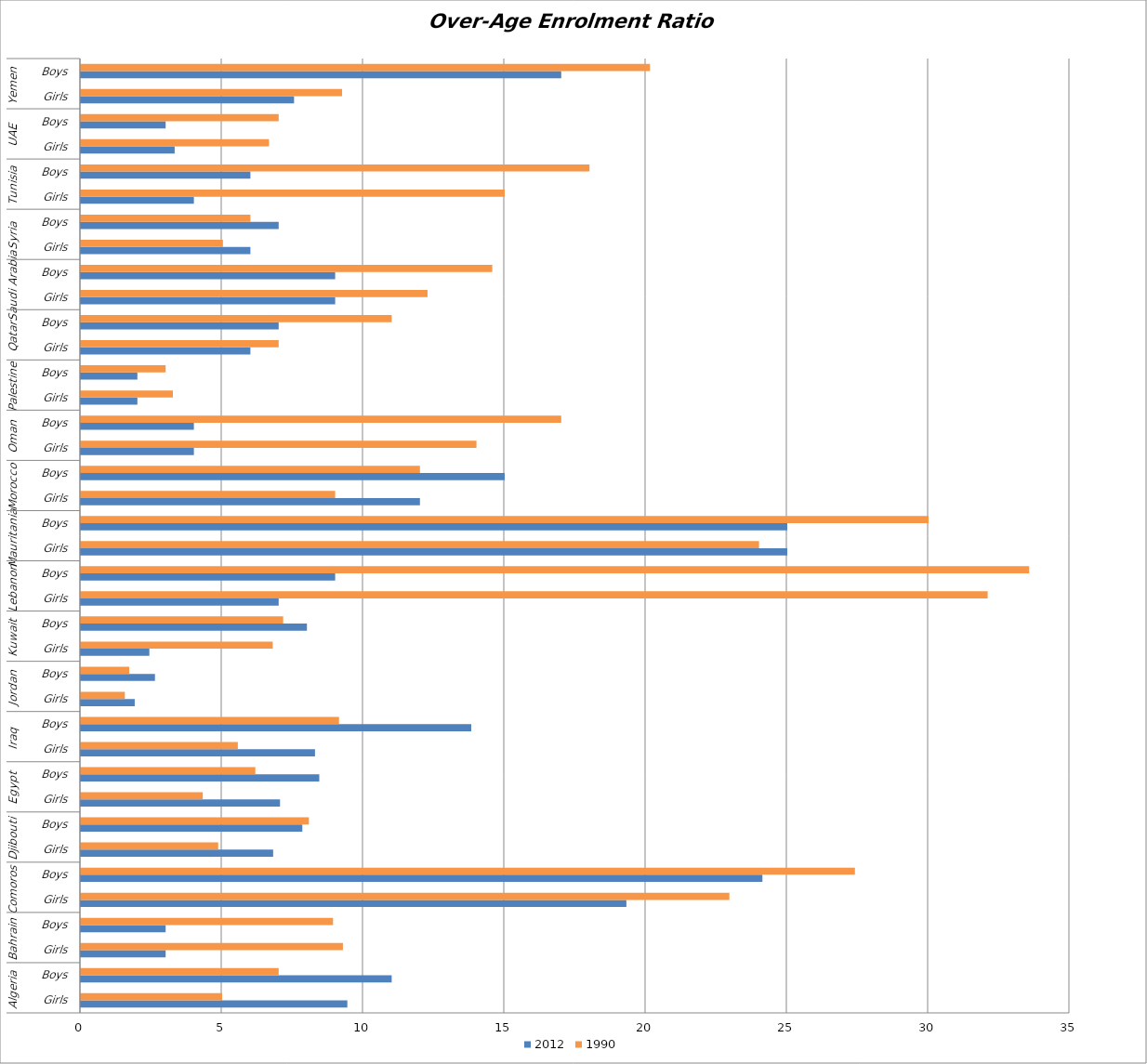
| Category | 2012 | 1990 |
|---|---|---|
| 0 | 9.43 | 5 |
| 1 | 11 | 7 |
| 2 | 3 | 9.274 |
| 3 | 3 | 8.924 |
| 4 | 19.306 | 22.951 |
| 5 | 24.12 | 27.393 |
| 6 | 6.805 | 4.86 |
| 7 | 7.837 | 8.07 |
| 8 | 7.048 | 4.313 |
| 9 | 8.437 | 6.175 |
| 10 | 8.286 | 5.555 |
| 11 | 13.816 | 9.136 |
| 12 | 1.906 | 1.556 |
| 13 | 2.622 | 1.713 |
| 14 | 2.424 | 6.79 |
| 15 | 8 | 7.16 |
| 16 | 7 | 32.092 |
| 17 | 9 | 33.559 |
| 18 | 25 | 24 |
| 19 | 25 | 30 |
| 20 | 12 | 9 |
| 21 | 15 | 12 |
| 22 | 4 | 14 |
| 23 | 4 | 17 |
| 24 | 2 | 3.257 |
| 25 | 2 | 3 |
| 26 | 6 | 7 |
| 27 | 7 | 11 |
| 28 | 9 | 12.268 |
| 29 | 9 | 14.559 |
| 30 | 6 | 5.028 |
| 31 | 7 | 6 |
| 32 | 4 | 15 |
| 33 | 6 | 18 |
| 34 | 3.32 | 6.658 |
| 35 | 3 | 7 |
| 36 | 7.545 | 9.244 |
| 37 | 17 | 20.141 |